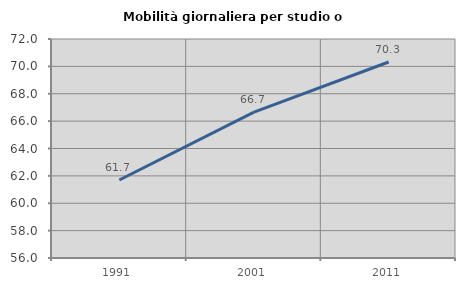
| Category | Mobilità giornaliera per studio o lavoro |
|---|---|
| 1991.0 | 61.701 |
| 2001.0 | 66.657 |
| 2011.0 | 70.321 |